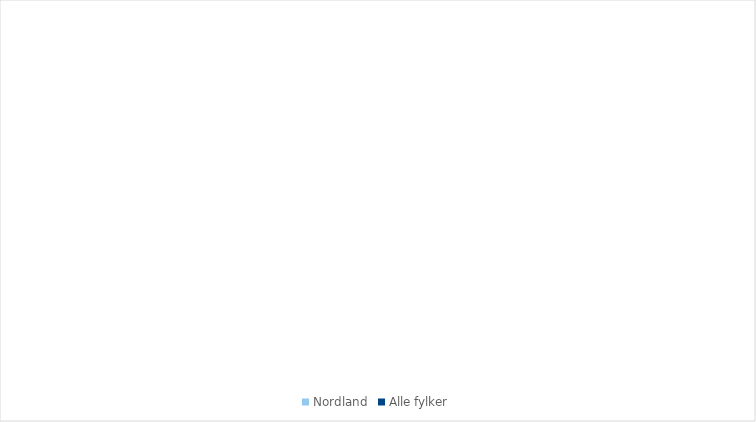
| Category | Nordland | Alle fylker |
|---|---|---|
| 1.1 Landbruk | 1.058 | 0.814 |
| 1.2 Fiske/oppdrett | 8.666 | 1.732 |
| 2.1 Primærforedlingsindustri | 3.5 | 2.443 |
| 2.2 Olje/gass, bergverk | 0.638 | 2.052 |
| 2.3 Teknologiindustri | 0.631 | 1.926 |
| 2.4 Annen industri | 4.719 | 3.764 |
| 3.1 Bygg/anlegg, energi, vann/
avløp, eiendom | 23.66 | 21.135 |
| 3.2 Transport- og distribusjonstjenester | 5.078 | 4.233 |
| 4.1 Kunnskapsintensiv forretningsmessig tjenesteyting (KIFT) | 6.73 | 16.953 |
| 4.2 Varehandel | 7.327 | 9.688 |
| 4.3 Overnatting og servering | 1.655 | 1.718 |
| 4.4 Annen privat dominert tjenesteyting | 3.997 | 5.772 |
| 5.1 Offentlig admistrasjon og forsvar | 9.821 | 8.035 |
| 5.2 Undervisning | 6.73 | 6.39 |
| 5.3 Helse- og omsorgstjenester | 15.791 | 13.343 |